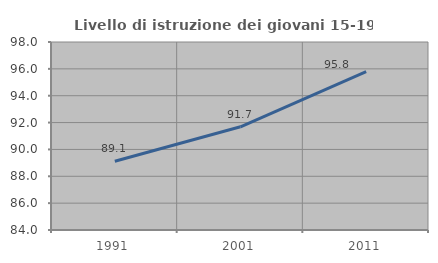
| Category | Livello di istruzione dei giovani 15-19 anni |
|---|---|
| 1991.0 | 89.12 |
| 2001.0 | 91.684 |
| 2011.0 | 95.792 |